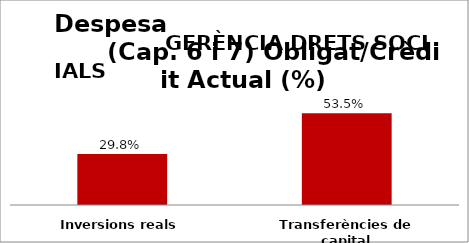
| Category | Series 0 |
|---|---|
| Inversions reals | 0.298 |
| Transferències de capital | 0.535 |